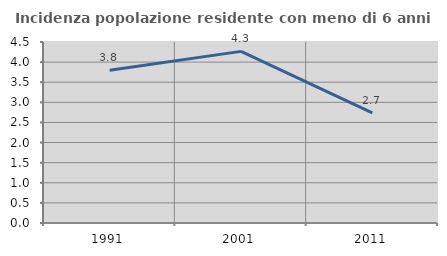
| Category | Incidenza popolazione residente con meno di 6 anni |
|---|---|
| 1991.0 | 3.797 |
| 2001.0 | 4.267 |
| 2011.0 | 2.74 |